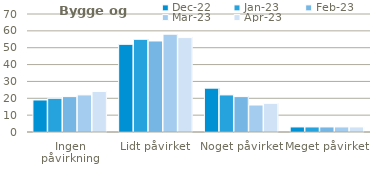
| Category | dec-22 | jan-23 | feb-23 | mar-23 | apr-23 |
|---|---|---|---|---|---|
| Ingen påvirkning | 19 | 20 | 21 | 22 | 24 |
| Lidt påvirket | 52 | 55 | 54 | 58 | 56 |
| Noget påvirket | 26 | 22 | 21 | 16 | 17 |
| Meget påvirket | 3 | 3 | 3 | 3 | 3 |